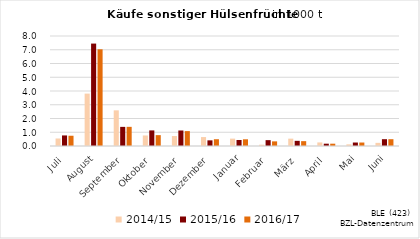
| Category | 2014/15 | 2015/16 | 2016/17 |
|---|---|---|---|
| Juli | 0.546 | 0.768 | 0.746 |
| August | 3.81 | 7.449 | 7.035 |
| September | 2.593 | 1.391 | 1.393 |
| Oktober | 0.765 | 1.134 | 0.79 |
| November | 0.725 | 1.128 | 1.083 |
| Dezember | 0.649 | 0.411 | 0.492 |
| Januar | 0.536 | 0.437 | 0.487 |
| Februar | 0.093 | 0.426 | 0.337 |
| März | 0.534 | 0.375 | 0.353 |
| April | 0.259 | 0.168 | 0.168 |
| Mai | 0.12 | 0.253 | 0.253 |
| Juni | 0.228 | 0.495 | 0.495 |